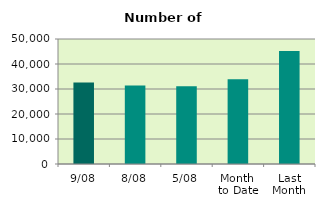
| Category | Series 0 |
|---|---|
| 9/08 | 32642 |
| 8/08 | 31360 |
| 5/08 | 31116 |
| Month 
to Date | 33917.429 |
| Last
Month | 45220.286 |